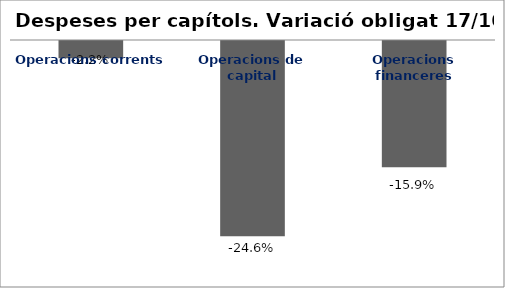
| Category | Series 0 |
|---|---|
| Operacions corrents | -0.022 |
| Operacions de capital | -0.246 |
| Operacions financeres | -0.159 |